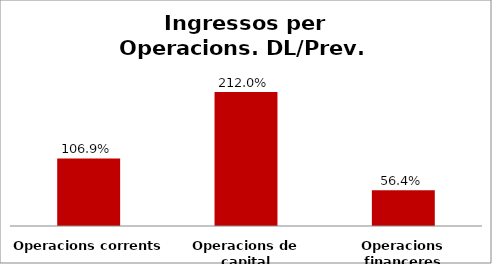
| Category | Series 0 |
|---|---|
| Operacions corrents | 1.069 |
| Operacions de capital | 2.12 |
| Operacions financeres | 0.564 |